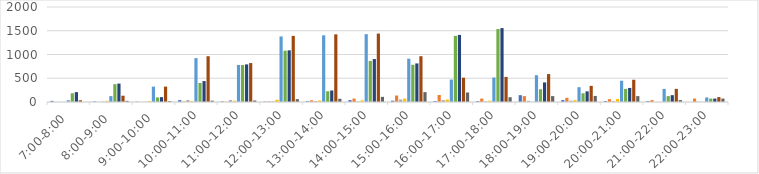
| Category | Series 0 | Series 1 | Series 2 | Series 3 | Series 4 | Series 5 | Series 6 | Series 7 | Series 8 |
|---|---|---|---|---|---|---|---|---|---|
| 7:00-8:00 | 24 | 0 | 0 | 0 | 36 | 184 | 208 | 36 | 0 |
| 8:00-9:00 | 12 | 0 | 8 | 24 | 124 | 376 | 388 | 132 | 24 |
| 9:00-10:00 | 6 | 0 | 0 | 20 | 324 | 96 | 102 | 324 | 20 |
| 10:00-11:00 | 40 | 8 | 40 | 20 | 924 | 400 | 440 | 964 | 28 |
| 11:00-12:00 | 12 | 4 | 40 | 28 | 780 | 780 | 792 | 820 | 32 |
| 12:00-13:00 | 8 | 12 | 12 | 48 | 1380 | 1080 | 1088 | 1392 | 60 |
| 13:00-14:00 | 16 | 36 | 20 | 32 | 1404 | 226 | 242 | 1424 | 68 |
| 14:00-15:00 | 40 | 72 | 12 | 36 | 1428 | 864 | 904 | 1440 | 108 |
| 15:00-16:00 | 28 | 136 | 52 | 72 | 912 | 784 | 812 | 964 | 208 |
| 16:00-17:00 | 20 | 148 | 40 | 52 | 472 | 1392 | 1412 | 512 | 200 |
| 17:00-18:00 | 20 | 72 | 12 | 28 | 516 | 1536 | 1556 | 528 | 100 |
| 18:00-19:00 | 144 | 124 | 24 | 0 | 564 | 268 | 412 | 588 | 124 |
| 19:00-20:00 | 40 | 88 | 28 | 40 | 312 | 184 | 224 | 340 | 128 |
| 20:00-21:00 | 20 | 60 | 20 | 64 | 448 | 276 | 296 | 468 | 124 |
| 21:00-22:00 | 20 | 40 | 0 | 0 | 276 | 124 | 144 | 276 | 40 |
| 22:00-23:00 | 0 | 72 | 8 | 0 | 96 | 72 | 72 | 104 | 72 |